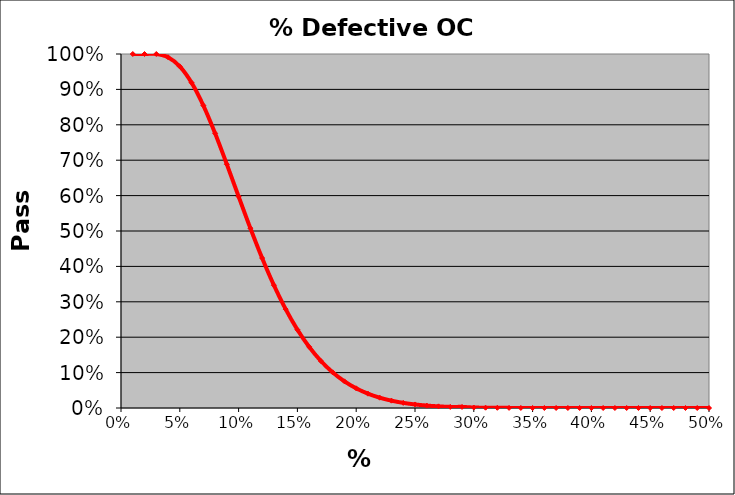
| Category | PASS 
RATE |
|---|---|
| 0.01 | 1 |
| 0.02 | 1 |
| 0.03 | 1 |
| 0.04 | 0.991 |
| 0.05 | 0.965 |
| 0.06 | 0.919 |
| 0.07 | 0.855 |
| 0.08 | 0.776 |
| 0.09 | 0.688 |
| 0.1 | 0.597 |
| 0.11 | 0.508 |
| 0.12 | 0.424 |
| 0.13 | 0.347 |
| 0.14 | 0.279 |
| 0.15 | 0.221 |
| 0.16 | 0.173 |
| 0.17 | 0.133 |
| 0.18 | 0.101 |
| 0.19 | 0.075 |
| 0.2 | 0.056 |
| 0.21 | 0.04 |
| 0.22 | 0.029 |
| 0.23 | 0.021 |
| 0.24 | 0.015 |
| 0.25 | 0.01 |
| 0.26 | 0.007 |
| 0.27 | 0.005 |
| 0.28 | 0.003 |
| 0.29 | 0.003 |
| 0.3 | 0.001 |
| 0.31 | 0.001 |
| 0.32 | 0.001 |
| 0.33 | 0 |
| 0.34 | 0 |
| 0.35 | 0 |
| 0.36 | 0 |
| 0.37 | 0 |
| 0.38 | 0 |
| 0.39 | 0 |
| 0.4 | 0 |
| 0.41 | 0 |
| 0.42 | 0 |
| 0.43 | 0 |
| 0.44 | 0 |
| 0.45 | 0 |
| 0.46 | 0 |
| 0.47 | 0 |
| 0.48 | 0 |
| 0.49 | 0 |
| 0.499999999999999 | 0 |